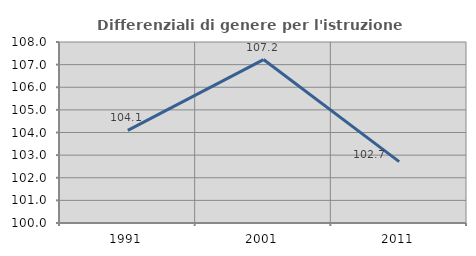
| Category | Differenziali di genere per l'istruzione superiore |
|---|---|
| 1991.0 | 104.092 |
| 2001.0 | 107.224 |
| 2011.0 | 102.713 |